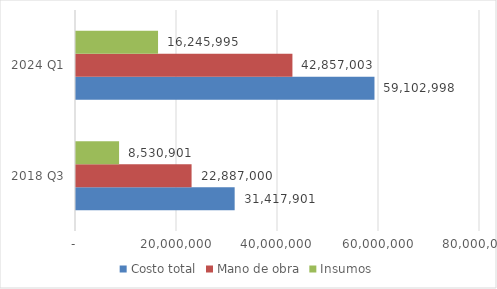
| Category | Costo total | Mano de obra | Insumos |
|---|---|---|---|
| 2018 Q3 | 31417901 | 22887000 | 8530901 |
| 2024 Q1 | 59102997.762 | 42857003 | 16245994.762 |